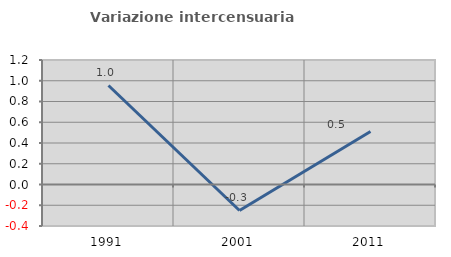
| Category | Variazione intercensuaria annua |
|---|---|
| 1991.0 | 0.955 |
| 2001.0 | -0.25 |
| 2011.0 | 0.511 |